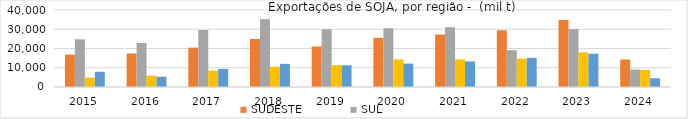
| Category | SUDESTE | SUL | NORTE | NORDESTE |
|---|---|---|---|---|
| 2015.0 | 16803.726 | 24766.136 | 4867.397 | 7886.974 |
| 2016.0 | 17420.76 | 22891.599 | 5882.904 | 5340.387 |
| 2017.0 | 20440.023 | 29614.782 | 8529.919 | 9386.021 |
| 2018.0 | 24921.654 | 35211.286 | 10528.549 | 12015.011 |
| 2019.0 | 21051.238 | 30035.114 | 11335.594 | 11292.631 |
| 2020.0 | 25524.654 | 30526.846 | 14353.507 | 12179.961 |
| 2021.0 | 27252.521 | 31051.227 | 14318.056 | 13267.949 |
| 2022.0 | 29444.378 | 19130.983 | 14737.599 | 15145.442 |
| 2023.0 | 34789.367 | 30084.315 | 17994.75 | 17269.391 |
| 2024.0 | 14309.548 | 9066.98 | 8816.351 | 4524.37 |